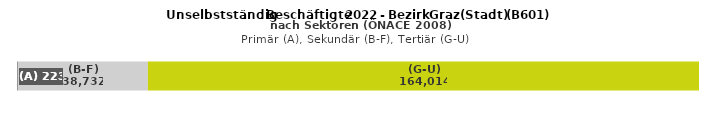
| Category | (A) | (B-F) | (G-U) |
|---|---|---|---|
| 0 | 223 | 38732 | 164014 |